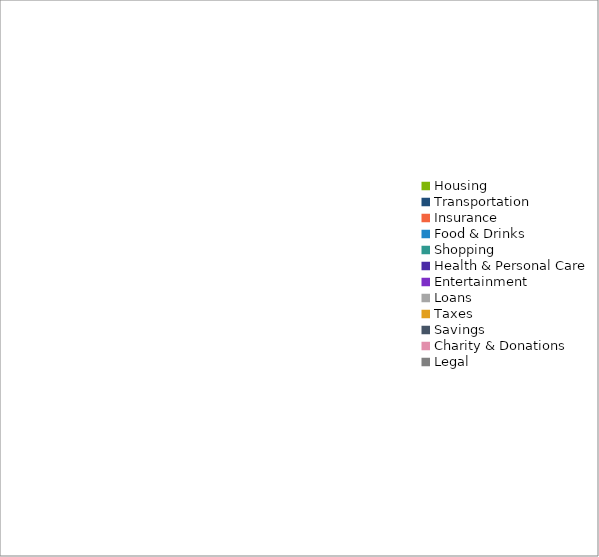
| Category | Series 0 |
|---|---|
| Housing | 0 |
| Transportation | 0 |
| Insurance | 0 |
| Food & Drinks | 0 |
| Shopping | 0 |
| Health & Personal Care | 0 |
| Entertainment | 0 |
| Loans | 0 |
| Taxes | 0 |
| Savings | 0 |
| Charity & Donations | 0 |
| Legal | 0 |